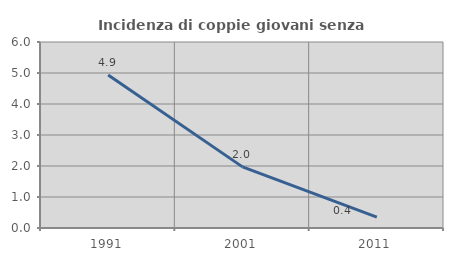
| Category | Incidenza di coppie giovani senza figli |
|---|---|
| 1991.0 | 4.938 |
| 2001.0 | 1.972 |
| 2011.0 | 0.352 |